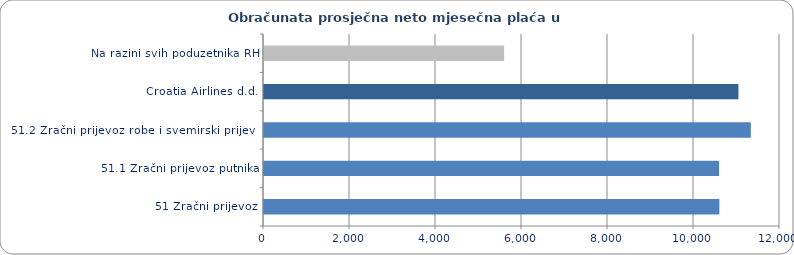
| Category | Obračunata prosječna neto mjesečna plaća u kunama |
|---|---|
| 51 Zračni prijevoz | 10590.027 |
| 51.1 Zračni prijevoz putnika | 10583.373 |
| 51.2 Zračni prijevoz robe i svemirski prijevoz | 11321.292 |
| Croatia Airlines d.d. | 11034.21 |
| Na razini svih poduzetnika RH | 5584.326 |